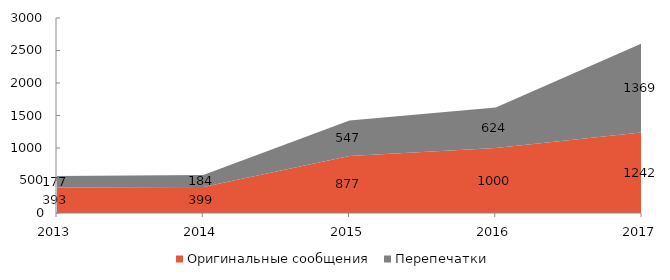
| Category | Оригинальные сообщения | Перепечатки |
|---|---|---|
| 2013 | 393 | 177 |
| 2014 | 399 | 184 |
| 2015 | 877 | 547 |
| 2016 | 1000 | 624 |
| 2017 | 1242 | 1369 |